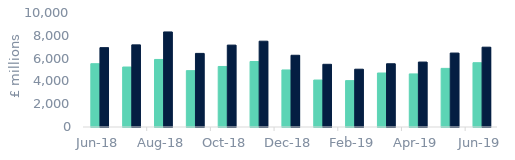
| Category | First-time
buyers | Homemovers |
|---|---|---|
| 2018-06-01 | 5551.141 | 6960.195 |
| 2018-07-01 | 5260.792 | 7204.742 |
| 2018-08-01 | 5924.466 | 8339.223 |
| 2018-09-01 | 4943.534 | 6455.858 |
| 2018-10-01 | 5308.614 | 7184.217 |
| 2018-11-01 | 5745.931 | 7526.586 |
| 2018-12-01 | 5002.92 | 6292.124 |
| 2019-01-01 | 4119.983 | 5499.374 |
| 2019-02-01 | 4068.91 | 5068.569 |
| 2019-03-01 | 4736.608 | 5547.424 |
| 2019-04-01 | 4655.633 | 5697.611 |
| 2019-05-01 | 5141.795 | 6486.092 |
| 2019-06-01 | 5639.027 | 7002.409 |